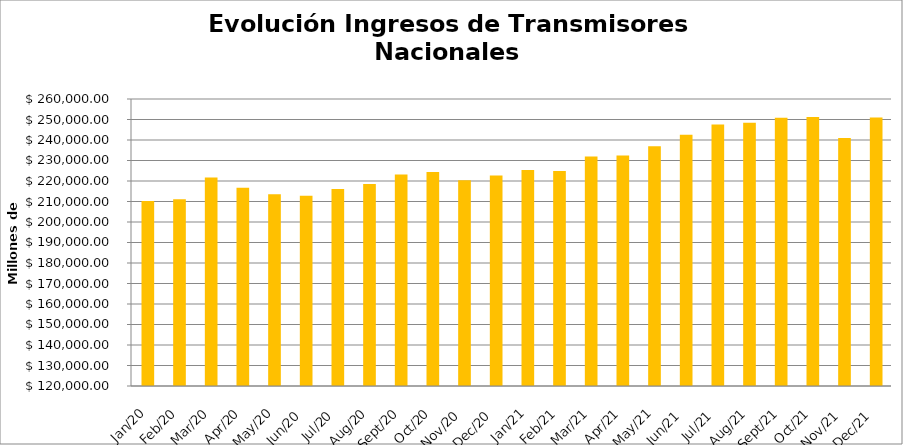
| Category | Series 0 |
|---|---|
| 2020-01-01 | 210231.092 |
| 2020-02-01 | 211100.875 |
| 2020-03-01 | 221718.387 |
| 2020-04-01 | 216724.219 |
| 2020-05-01 | 213523.566 |
| 2020-06-01 | 212836.811 |
| 2020-07-01 | 216148.494 |
| 2020-08-01 | 218486.372 |
| 2020-09-01 | 223178.705 |
| 2020-10-01 | 224359.789 |
| 2020-11-01 | 220386.024 |
| 2020-12-01 | 222672.516 |
| 2021-01-01 | 225357.863 |
| 2021-02-01 | 224890.278 |
| 2021-03-01 | 231904.155 |
| 2021-04-01 | 232486.69 |
| 2021-05-01 | 236978.468 |
| 2021-06-01 | 242592.892 |
| 2021-07-01 | 247503.344 |
| 2021-08-01 | 248459.281 |
| 2021-09-01 | 250852.235 |
| 2021-10-01 | 251199.743 |
| 2021-11-01 | 241020.517 |
| 2021-12-01 | 251033.984 |